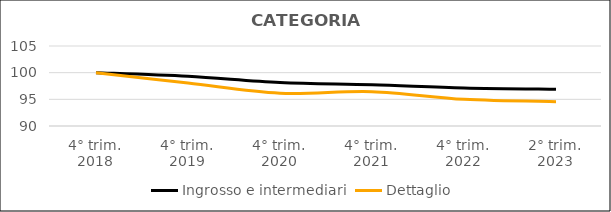
| Category | Ingrosso e intermediari | Dettaglio  |
|---|---|---|
| 4° trim.
2018 | 100 | 100 |
| 4° trim.
2019 | 99.318 | 98.045 |
| 4° trim.
2020 | 98.14 | 96.146 |
| 4° trim.
2021 | 97.731 | 96.443 |
| 4° trim.
2022 | 97.146 | 95.007 |
| 2° trim.
2023 | 96.893 | 94.562 |